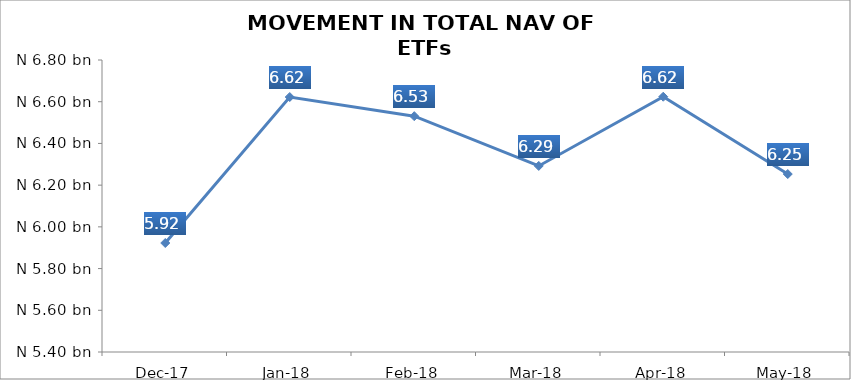
| Category | Series 0 |
|---|---|
| 2017-12-01 | 5922585158.84 |
| 2018-01-01 | 6622511401.11 |
| 2018-02-01 | 6530678114.87 |
| 2018-03-01 | 6292081212.23 |
| 2018-04-01 | 6623939625.39 |
| 2018-05-01 | 6253239764.9 |